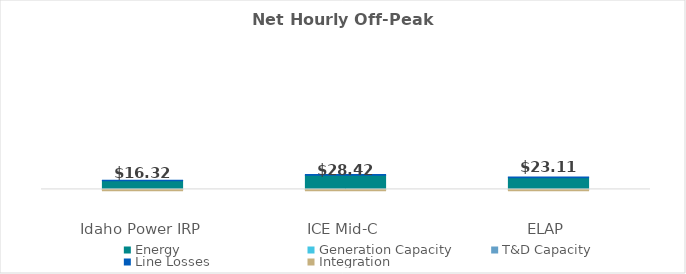
| Category | Energy | Generation Capacity | T&D Capacity | Line Losses | Integration |
|---|---|---|---|---|---|
| 0 | 18.193 | 0 | 0 | 1.055 | -2.93 |
| 1 | 29.629 | 0 | 0 | 1.718 | -2.93 |
| 2 | 24.612 | 0 | 0 | 1.427 | -2.93 |